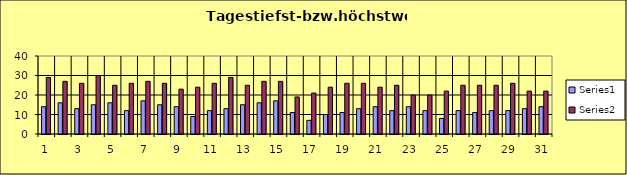
| Category | Series 0 | Series 1 |
|---|---|---|
| 0 | 14 | 29 |
| 1 | 16 | 27 |
| 2 | 13 | 26 |
| 3 | 15 | 30 |
| 4 | 16 | 25 |
| 5 | 12 | 26 |
| 6 | 17 | 27 |
| 7 | 15 | 26 |
| 8 | 14 | 23 |
| 9 | 9 | 24 |
| 10 | 12 | 26 |
| 11 | 13 | 29 |
| 12 | 15 | 25 |
| 13 | 16 | 27 |
| 14 | 17 | 27 |
| 15 | 11 | 19 |
| 16 | 7 | 21 |
| 17 | 10 | 24 |
| 18 | 11 | 26 |
| 19 | 13 | 26 |
| 20 | 14 | 24 |
| 21 | 12 | 25 |
| 22 | 14 | 20 |
| 23 | 12 | 20 |
| 24 | 8 | 22 |
| 25 | 12 | 25 |
| 26 | 11 | 25 |
| 27 | 12 | 25 |
| 28 | 12 | 26 |
| 29 | 13 | 22 |
| 30 | 14 | 22 |